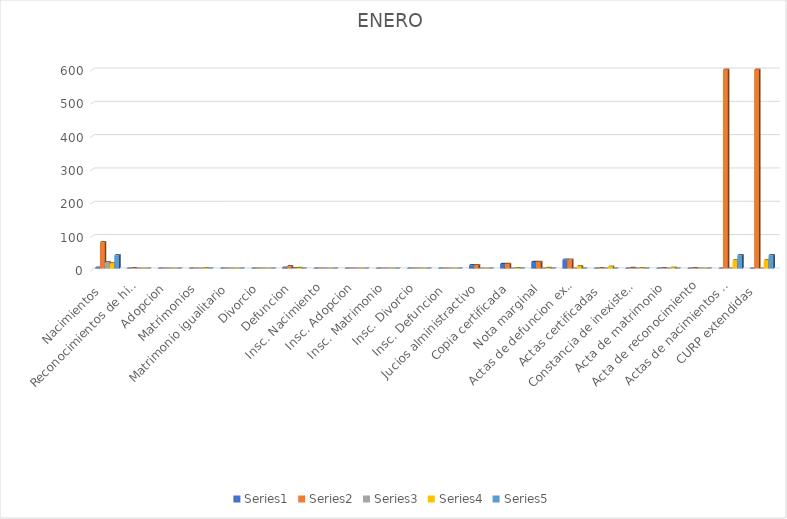
| Category | Series 0 | Series 1 | Series 2 | Series 3 | Series 4 |
|---|---|---|---|---|---|
| Nacimientos  | 3 | 79 | 19 | 16 | 40 |
| Reconocimientos de hijos | 0 | 1 | 0 | 0 | 0 |
| Adopcion | 0 | 0 | 0 | 0 | 0 |
| Matrimonios | 0 | 0 | 0 | 1 | 0 |
| Matrimonio igualitario | 0 | 0 | 0 | 0 | 0 |
| Divorcio | 0 | 0 | 0 | 0 | 0 |
| Defuncion | 3 | 7 | 1 | 2 | 0 |
| Insc. Nacimiento | 0 | 0 | 0 | 0 | 0 |
| Insc. Adopcion | 0 | 0 | 0 | 0 | 0 |
| Insc. Matrimonio | 0 | 0 | 0 | 0 | 0 |
| Insc. Divorcio | 0 | 0 | 0 | 0 | 0 |
| Insc. Defuncion  | 0 | 0 | 0 | 0 | 0 |
| Jucios alministractivo | 10 | 10 | 0 | 0 | 0 |
| Copia certificada | 14 | 14 | 0 | 1 | 0 |
| Nota marginal | 20 | 20 | 0 | 2 | 0 |
| Actas de defuncion extendidas | 27 | 27 | 0 | 7 | 0 |
| Actas certificadas  | 0 | 1 | 0 | 6 | 0 |
| Constancia de inexistencia de matrimonio | 0 | 2 | 0 | 1 | 0 |
| Acta de matrimonio | 0 | 1 | 0 | 3 | 0 |
| Acta de reconocimiento | 0 | 1 | 0 | 0 | 0 |
| Actas de nacimientos extendidas  | 0 | 597 | 0 | 25 | 40 |
| CURP extendidas  | 0 | 597 | 0 | 25 | 40 |